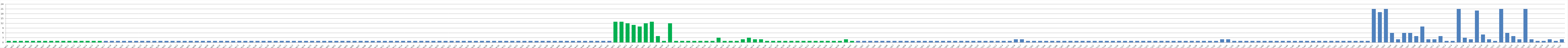
| Category | Series 0 |
|---|---|
| AW01 | 1 |
| AW02 | 1 |
| AW03 | 1 |
| AW04 | 1 |
| AW05 | 1 |
| AW06 | 1 |
| AW07 | 1 |
| AW08 | 1 |
| AW09 | 1 |
| AW10 | 1 |
| AW11 | 1 |
| AW12 | 1 |
| AW13 | 1 |
| AW14 | 1 |
| AW15 | 1 |
| AW16 | 1 |
| AW17 | 1 |
| AW18 | 1 |
| AW19 | 1 |
| AW20 | 1 |
| AW21 | 1 |
| AW22 | 1 |
| AW23 | 1 |
| AW24 | 1 |
| AW25 | 1 |
| AW26 | 1 |
| BW01 | 1 |
| BW02 | 1 |
| BW03 | 1 |
| BWO4 | 1 |
| BW05 | 1 |
| BW06 | 1 |
| BW07 | 1 |
| BW08 | 1 |
| BW09 | 1 |
| BW10 | 1 |
| BW11 | 1 |
| BW12 | 1 |
| BW13 | 1 |
| BW14 | 1 |
| BW15 | 1 |
| BW16 | 1 |
| BW17 | 1 |
| BW18 | 1 |
| BW19 | 1 |
| BW20 | 1 |
| BW21 | 1 |
| BW22 | 1 |
| BW23 | 1 |
| BW24 | 1 |
| BW25 | 1 |
| BW26 | 1 |
| CW01 | 1 |
| CW02 | 1 |
| CW03 | 1 |
| CW04 | 1 |
| CW05 | 1 |
| CW06 | 1 |
| CW07 | 1 |
| CW08 | 1 |
| CW09 | 1 |
| CW10 | 1 |
| CW11 | 1 |
| CW12 | 1 |
| CW13 | 1 |
| CW14 | 1 |
| CW15 | 1 |
| CW16 | 1 |
| CW17 | 1 |
| CW18 | 1 |
| CW19 | 1 |
| CW20 | 1 |
| CW21 | 1 |
| CW22 | 1 |
| CW23 | 1 |
| CW24 | 1 |
| CW25 | 1 |
| CW26 | 1 |
| CW27 | 1 |
| CW28 | 1 |
| CW29 | 1 |
| CW30 | 1 |
| CW31 | 1 |
| CW32 | 1 |
| CW33 | 1 |
| CW34 | 1 |
| CW35 | 1 |
| CW36 | 1 |
| CW37 | 1 |
| CW38 | 1 |
| CW39 | 1 |
| CW40 | 1 |
| CW41 | 1 |
| CW42 | 1 |
| CW43 | 1 |
| CW44 | 1 |
| CW45 | 1 |
| CW46 | 1 |
| CW47 | 1 |
| CW48 | 1 |
| DW01 | 13 |
| DW02 | 13 |
| DW03 | 12 |
| DW04 | 11 |
| DW05 | 10 |
| DW06 | 12 |
| DW07 | 13 |
| DW08 | 4 |
| DW09 | 1 |
| DW10 | 12 |
| DW11 | 1 |
| DW12 | 1 |
| DW13 | 1 |
| DW14 | 1 |
| DW15 | 1 |
| DW16 | 1 |
| DW17 | 1 |
| DW18 | 3 |
| DW19 | 1 |
| DW20 | 1 |
| DW21 | 1 |
| DW22 | 2 |
| DW23 | 3 |
| DW24 | 2 |
| DW25 | 2 |
| DW26 | 1 |
| DW27 | 1 |
| DW28 | 1 |
| DW29 | 1 |
| DW30 | 1 |
| DW31 | 1 |
| DW32 | 1 |
| DW33 | 1 |
| DW34 | 1 |
| DW35 | 1 |
| DW36 | 1 |
| DW37 | 1 |
| DW38 | 1 |
| DW39 | 2 |
| DW40 | 1 |
| AU01 | 1 |
| AU02 | 1 |
| AU03 | 1 |
| AU04 | 1 |
| AU05 | 1 |
| AU06 | 1 |
| AU07 | 1 |
| AU08 | 1 |
| AU09 | 1 |
| AU10 | 1 |
| AU11 | 1 |
| BU01 | 1 |
| BU02 | 1 |
| BU03 | 1 |
| BU04 | 1 |
| BU05 | 1 |
| BU06 | 1 |
| BU07 | 1 |
| BU08 | 1 |
| BU09 | 1 |
| BU10 | 1 |
| BU11 | 1 |
| BU12 | 1 |
| BU13 | 1 |
| BU14 | 1 |
| BU15 | 1 |
| BU16 | 2 |
| BU17 | 2 |
| CU01 | 1 |
| CU02 | 1 |
| CU03 | 1 |
| CU04 | 1 |
| CU05 | 1 |
| CU06 | 1 |
| CU07 | 1 |
| CU08 | 1 |
| CU09 | 1 |
| CU10 | 1 |
| CU11 | 1 |
| CU12 | 1 |
| CU13 | 1 |
| CU14 | 1 |
| CU15 | 1 |
| CU16 | 1 |
| CU17 | 1 |
| CU18 | 1 |
| CU19 | 1 |
| CU20 | 1 |
| CU21 | 1 |
| CU22 | 1 |
| CU23 | 1 |
| CU24 | 1 |
| CU25 | 1 |
| CU26 | 1 |
| CU27 | 1 |
| CU28 | 1 |
| CU29 | 1 |
| CU30 | 1 |
| CU31 | 1 |
| CU32 | 1 |
| CU33 | 2 |
| CU34 | 2 |
| CU35 | 1 |
| CU36 | 1 |
| CU37 | 1 |
| CU38 | 1 |
| CU39 | 1 |
| CU40 | 1 |
| CU41 | 1 |
| CU42 | 1 |
| CU43 | 1 |
| CU44 | 1 |
| CU45 | 1 |
| CU46 | 1 |
| CU47 | 1 |
| CU48 | 1 |
| CU49 | 1 |
| CU50 | 1 |
| CU51 | 1 |
| CU52 | 1 |
| CU53 | 1 |
| CU54 | 1 |
| CU55 | 1 |
| CU56 | 1 |
| CU57 | 1 |
| DU01 | 21 |
| DU02 | 19 |
| DU03 | 21 |
| DU04 | 6 |
| DU05 | 2 |
| DU06 | 6 |
| DU07 | 6 |
| DU08 | 4 |
| DU09 | 10 |
| DU10 | 2 |
| DU11 | 2 |
| DU12 | 4 |
| DU13 | 1 |
| DU14 | 1 |
| DU15 | 21 |
| DU16 | 3 |
| DU17 | 2 |
| DU18 | 20 |
| DU19 | 5 |
| DU20 | 2 |
| DU21 | 1 |
| DU22 | 21 |
| DU23 | 6 |
| DU24 | 4 |
| DU25 | 2 |
| DU26 | 21 |
| DU27 | 2 |
| DU28 | 1 |
| DU29 | 1 |
| DU30 | 2 |
| DU31 | 1 |
| DU32 | 2 |